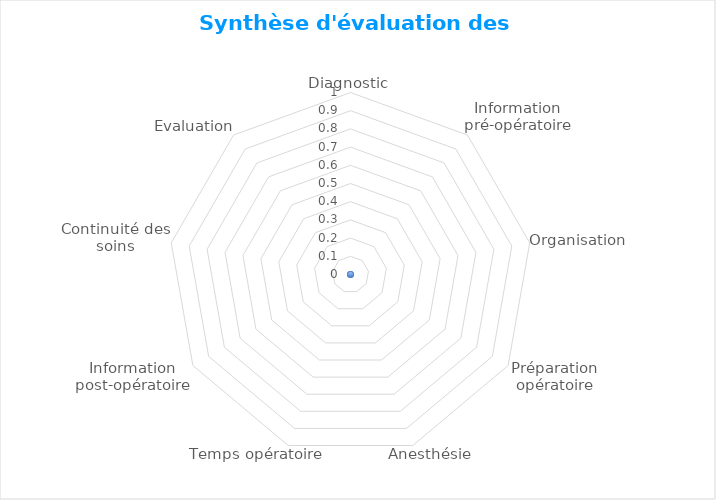
| Category | Series 0 |
|---|---|
| Diagnostic | 0 |
| Information pré-opératoire | 0 |
| Organisation | 0 |
| Préparation opératoire | 0 |
| Anesthésie | 0 |
| Temps opératoire | 0 |
| Information post-opératoire | 0 |
| Continuité des soins | 0 |
| Evaluation | 0 |